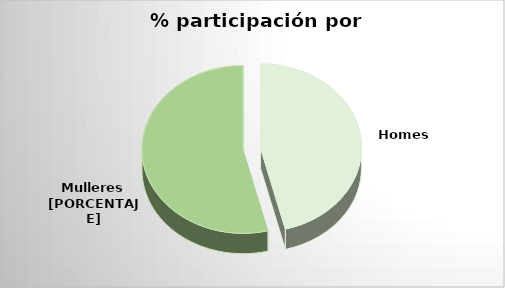
| Category | Series 0 |
|---|---|
| 0 | 87 |
| 1 | 102 |